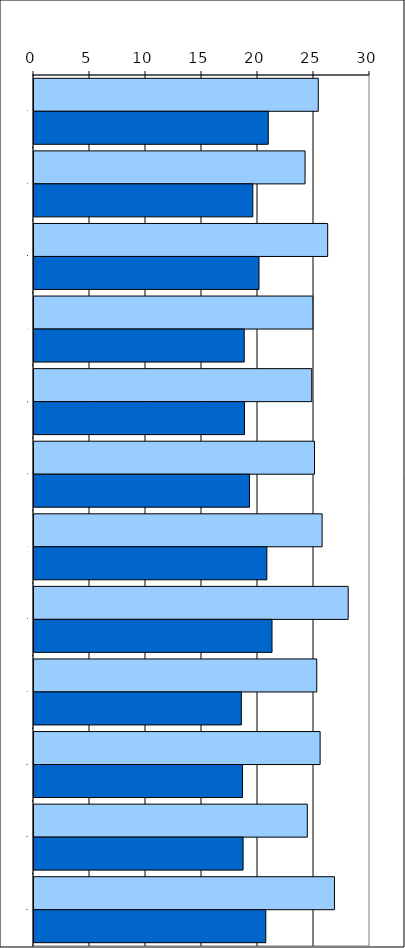
| Category | 25,4 24,2 26,2 24,9 24,8 25,0 25,7 28,1 25,2 25,5 24,4 26,8 | Series 1 |
|---|---|---|
| 0 | 25.382 | 20.915 |
| 1 | 24.202 | 19.535 |
| 2 | 26.222 | 20.088 |
| 3 | 24.903 | 18.77 |
| 4 | 24.797 | 18.797 |
| 5 | 25.043 | 19.243 |
| 6 | 25.725 | 20.792 |
| 7 | 28.052 | 21.252 |
| 8 | 25.247 | 18.513 |
| 9 | 25.547 | 18.613 |
| 10 | 24.402 | 18.668 |
| 11 | 26.828 | 20.695 |